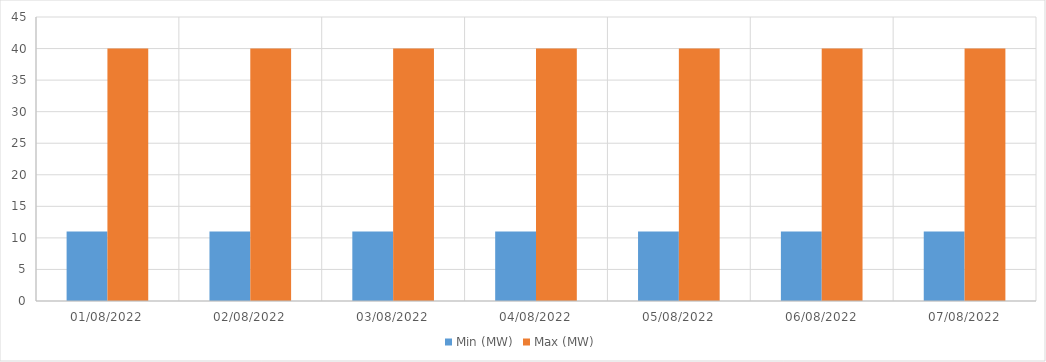
| Category | Min (MW) | Max (MW) |
|---|---|---|
| 01/08/2022 | 11 | 40 |
| 02/08/2022 | 11 | 40 |
| 03/08/2022 | 11 | 40 |
| 04/08/2022 | 11 | 40 |
| 05/08/2022 | 11 | 40 |
| 06/08/2022 | 11 | 40 |
| 07/08/2022 | 11 | 40 |